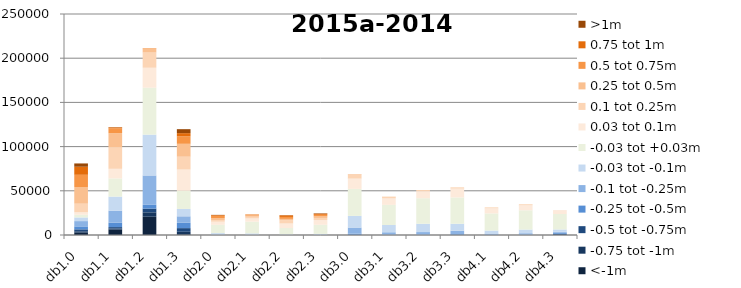
| Category | <-1m | -0.75 tot -1m | -0.5 tot -0.75m | -0.25 tot -0.5m | -0.1 tot -0.25m | -0.03 tot -0.1m | -0.03 tot +0.03m | 0.03 tot 0.1m | 0.1 tot 0.25m | 0.25 tot 0.5m | 0.5 tot 0.75m | 0.75 tot 1m | >1m |
|---|---|---|---|---|---|---|---|---|---|---|---|---|---|
| db1.0 | 2603 | 1559 | 2212 | 3355 | 5993 | 4149 | 3026 | 2828 | 9702 | 18883 | 13792 | 9130 | 3712 |
| db1.1 | 6023 | 1344 | 1579 | 5089 | 13536 | 15875 | 20539 | 10899 | 24095 | 16161 | 5588 | 996 | 274 |
| db1.2 | 20673 | 4970 | 4176 | 4298 | 33219 | 46193 | 53066 | 22623 | 17159 | 4550 | 543 | 3 | 0 |
| db1.3 | 841 | 2812 | 4125 | 6037 | 7326 | 8363 | 20474 | 24091 | 14490 | 14603 | 8403 | 3664 | 4481 |
| db2.0 | 8 | 16 | 22 | 130 | 350 | 1618 | 9360 | 3561 | 1776 | 2382 | 2438 | 808 | 293 |
| db2.1 | 0 | 0 | 2 | 9 | 227 | 1581 | 13248 | 3708 | 1873 | 1271 | 1037 | 361 | 24 |
| db2.2 | 0 | 0 | 0 | 29 | 192 | 550 | 7088 | 5169 | 3575 | 1629 | 2214 | 1811 | 217 |
| db2.3 | 0 | 0 | 0 | 4 | 132 | 1148 | 10265 | 5361 | 2354 | 1834 | 1762 | 1218 | 473 |
| db3.0 | 16 | 26 | 156 | 1328 | 6916 | 13169 | 30539 | 11629 | 4457 | 540 | 66 | 24 | 32 |
| db3.1 | 0 | 5 | 11 | 310 | 2791 | 8218 | 22751 | 7359 | 1811 | 154 | 12 | 2 | 1 |
| db3.2 | 0 | 1 | 33 | 273 | 3027 | 9414 | 28864 | 7844 | 1379 | 98 | 9 | 1 | 1 |
| db3.3 | 22 | 38 | 117 | 746 | 3954 | 7841 | 29708 | 10118 | 1256 | 110 | 10 | 0 | 0 |
| db4.1 | 0 | 2 | 8 | 186 | 1433 | 3378 | 19393 | 5856 | 909 | 83 | 9 | 0 | 0 |
| db4.2 | 3 | 11 | 36 | 354 | 1617 | 4123 | 21795 | 5712 | 1034 | 101 | 7 | 0 | 0 |
| db4.3 | 8 | 152 | 1254 | 1148 | 1069 | 2637 | 17463 | 3704 | 334 | 54 | 2 | 0 | 0 |